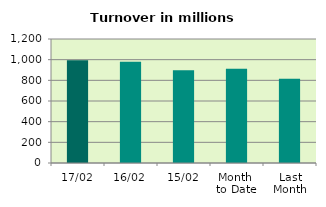
| Category | Series 0 |
|---|---|
| 17/02 | 993.38 |
| 16/02 | 980.693 |
| 15/02 | 898.514 |
| Month 
to Date | 911.871 |
| Last
Month | 814.821 |